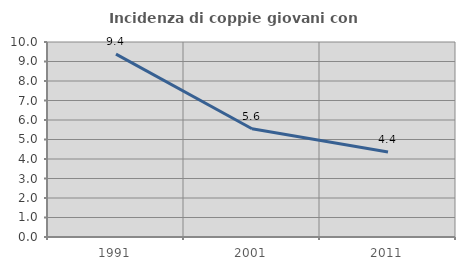
| Category | Incidenza di coppie giovani con figli |
|---|---|
| 1991.0 | 9.38 |
| 2001.0 | 5.551 |
| 2011.0 | 4.36 |